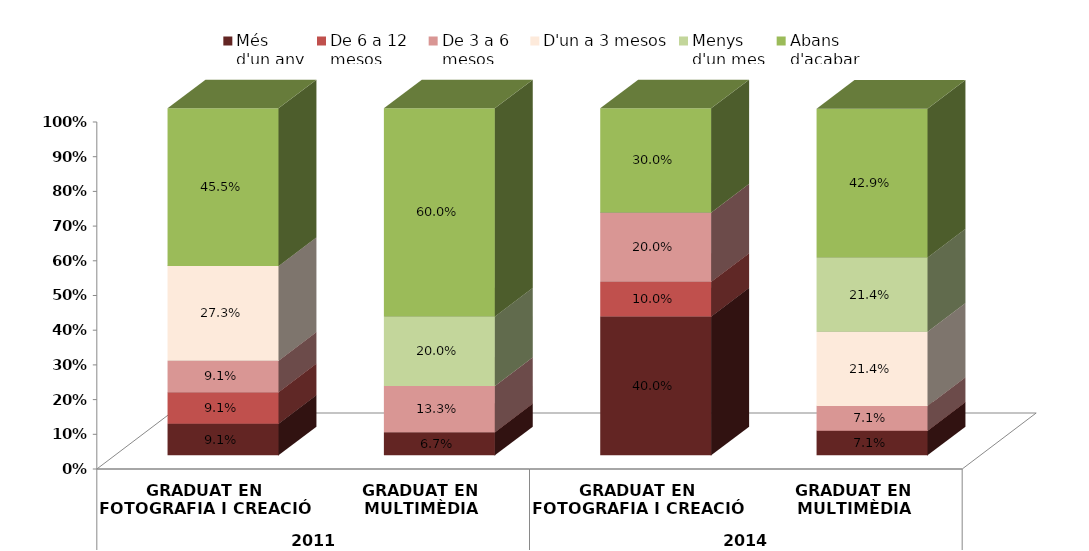
| Category | Més
d'un any | De 6 a 12
mesos | De 3 a 6
mesos | D'un a 3 mesos | Menys
d'un mes | Abans
d'acabar |
|---|---|---|---|---|---|---|
| 0 | 0.091 | 0.091 | 0.091 | 0.273 | 0 | 0.455 |
| 1 | 0.067 | 0 | 0.133 | 0 | 0.2 | 0.6 |
| 2 | 0.4 | 0.1 | 0.2 | 0 | 0 | 0.3 |
| 3 | 0.071 | 0 | 0.071 | 0.214 | 0.214 | 0.429 |